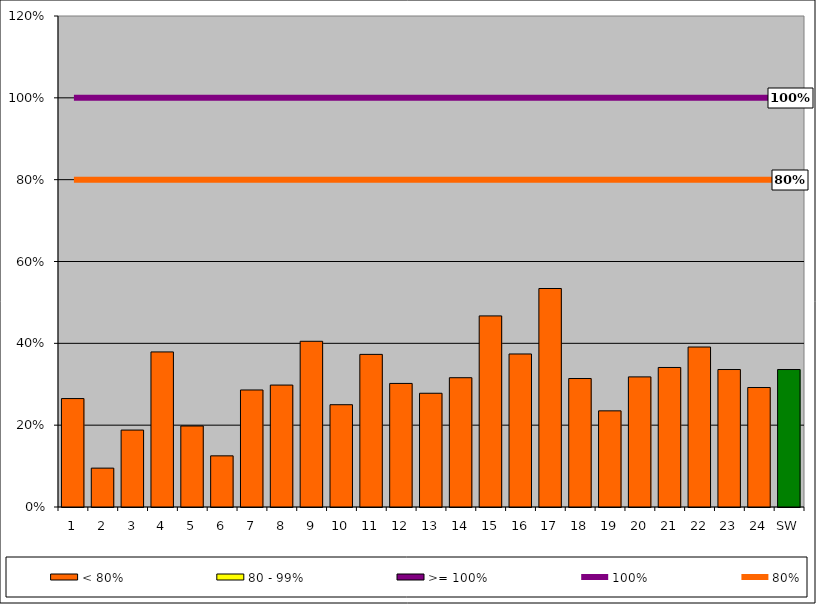
| Category | < 80% | 80 - 99% | >= 100% |
|---|---|---|---|
| 1 | 0.265 | 0 | 0 |
| 2 | 0.095 | 0 | 0 |
| 3 | 0.188 | 0 | 0 |
| 4 | 0.379 | 0 | 0 |
| 5 | 0.198 | 0 | 0 |
| 6 | 0.125 | 0 | 0 |
| 7 | 0.286 | 0 | 0 |
| 8 | 0.298 | 0 | 0 |
| 9 | 0.405 | 0 | 0 |
| 10 | 0.25 | 0 | 0 |
| 11 | 0.373 | 0 | 0 |
| 12 | 0.302 | 0 | 0 |
| 13 | 0.278 | 0 | 0 |
| 14 | 0.316 | 0 | 0 |
| 15 | 0.467 | 0 | 0 |
| 16 | 0.374 | 0 | 0 |
| 17 | 0.534 | 0 | 0 |
| 18 | 0.314 | 0 | 0 |
| 19 | 0.235 | 0 | 0 |
| 20 | 0.318 | 0 | 0 |
| 21 | 0.341 | 0 | 0 |
| 22 | 0.391 | 0 | 0 |
| 23 | 0.336 | 0 | 0 |
| 24 | 0.292 | 0 | 0 |
| SW | 0.336 | 0 | 0 |